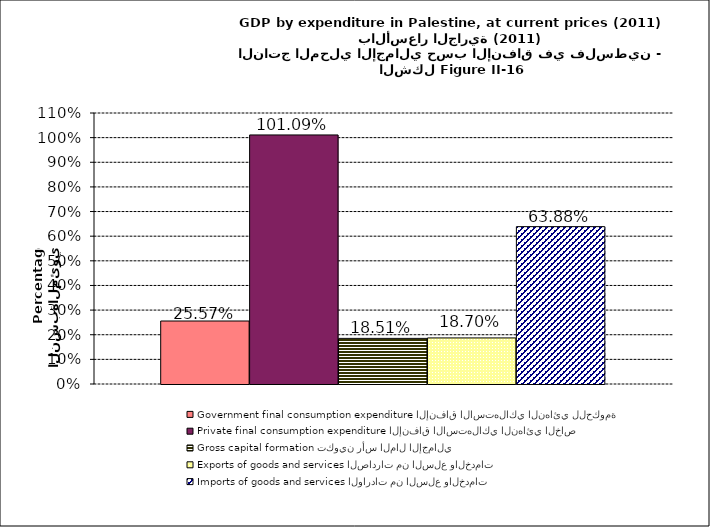
| Category | Government final consumption expenditure الإنفاق الاستهلاكي النهائي للحكومة | Private final consumption expenditure الإنفاق الاستهلاكي النهائي الخاص | Gross capital formation تكوين رأس المال الإجمالي | Exports of goods and services الصادرات من السلع والخدمات | Imports of goods and services الواردات من السلع والخدمات |
|---|---|---|---|---|---|
| 0 | 0.256 | 1.011 | 0.185 | 0.187 | 0.639 |